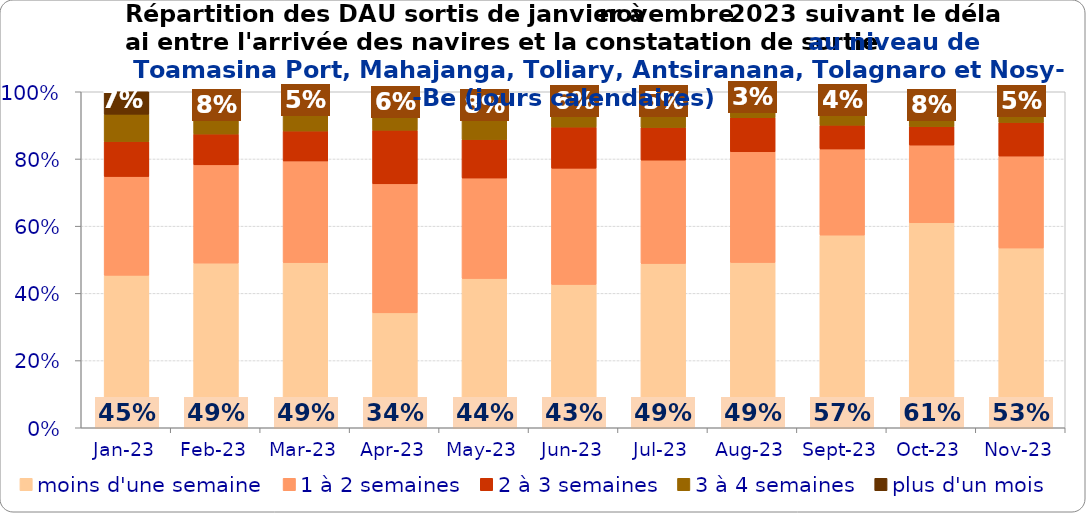
| Category | moins d'une semaine | 1 à 2 semaines | 2 à 3 semaines | 3 à 4 semaines | plus d'un mois |
|---|---|---|---|---|---|
| 2023-01-01 | 0.454 | 0.294 | 0.104 | 0.081 | 0.067 |
| 2023-02-01 | 0.49 | 0.292 | 0.092 | 0.048 | 0.078 |
| 2023-03-01 | 0.492 | 0.303 | 0.089 | 0.066 | 0.051 |
| 2023-04-01 | 0.342 | 0.384 | 0.16 | 0.057 | 0.057 |
| 2023-05-01 | 0.444 | 0.299 | 0.115 | 0.066 | 0.076 |
| 2023-06-01 | 0.427 | 0.346 | 0.122 | 0.049 | 0.056 |
| 2023-07-01 | 0.489 | 0.308 | 0.097 | 0.053 | 0.054 |
| 2023-08-01 | 0.492 | 0.33 | 0.101 | 0.045 | 0.032 |
| 2023-09-01 | 0.573 | 0.256 | 0.071 | 0.055 | 0.045 |
| 2023-10-01 | 0.61 | 0.231 | 0.055 | 0.024 | 0.08 |
| 2023-11-01 | 0.535 | 0.274 | 0.1 | 0.039 | 0.052 |